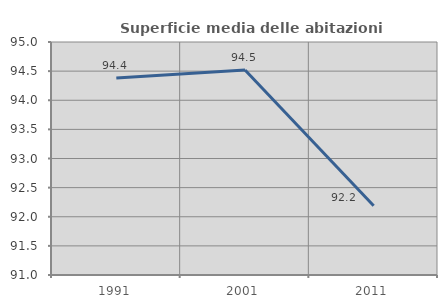
| Category | Superficie media delle abitazioni occupate |
|---|---|
| 1991.0 | 94.383 |
| 2001.0 | 94.518 |
| 2011.0 | 92.189 |